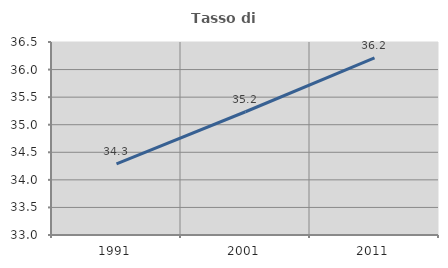
| Category | Tasso di occupazione   |
|---|---|
| 1991.0 | 34.288 |
| 2001.0 | 35.235 |
| 2011.0 | 36.211 |